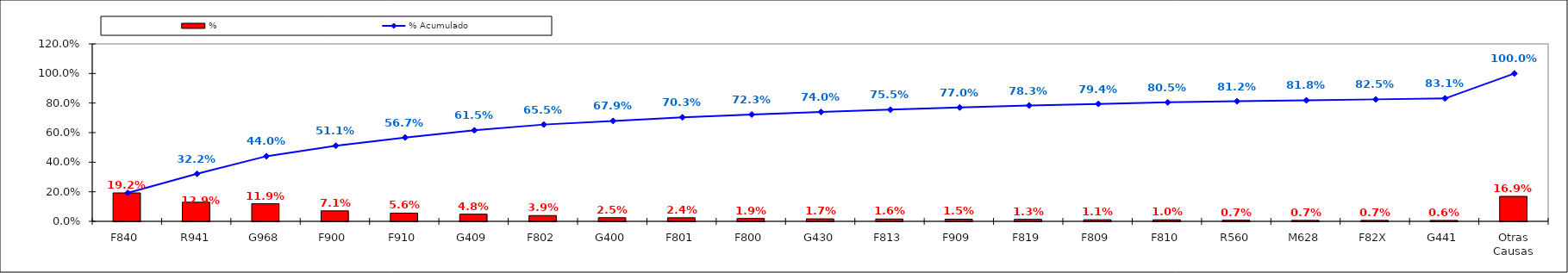
| Category | % |
|---|---|
| F840 | 0.192 |
| R941 | 0.129 |
| G968 | 0.119 |
| F900 | 0.071 |
| F910 | 0.056 |
| G409 | 0.048 |
| F802 | 0.039 |
| G400 | 0.025 |
| F801 | 0.024 |
| F800 | 0.019 |
| G430 | 0.017 |
| F813 | 0.016 |
| F909 | 0.015 |
| F819 | 0.013 |
| F809 | 0.011 |
| F810 | 0.01 |
| R560 | 0.007 |
| M628 | 0.007 |
| F82X | 0.007 |
| G441 | 0.006 |
| Otras Causas | 0.169 |